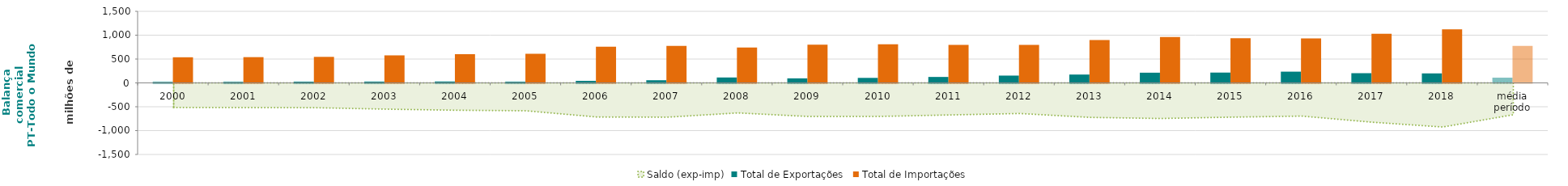
| Category | Total de Exportações  | Total de Importações  |
|---|---|---|
| 2000 | 21.045 | 536.924 |
| 2001 | 21.969 | 539.787 |
| 2002 | 25.673 | 545.406 |
| 2003 | 26.816 | 576.948 |
| 2004 | 28.473 | 601.468 |
| 2005 | 24.529 | 609.431 |
| 2006 | 43.235 | 758.088 |
| 2007 | 55.868 | 774.848 |
| 2008 | 113.493 | 743.048 |
| 2009 | 94.986 | 798.961 |
| 2010 | 104.812 | 808.095 |
| 2011 | 124.655 | 796.897 |
| 2012 | 153.084 | 794.759 |
| 2013 | 174.954 | 898.104 |
| 2014 | 213.66 | 959.857 |
| 2015 | 216.25 | 934.523 |
| 2016 | 235.586 | 931.359 |
| 2017 | 203.466 | 1027.78 |
| 2018 | 199.137 | 1124.054 |
| média período | 109.563 | 776.86 |